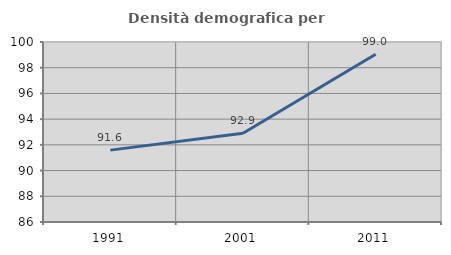
| Category | Densità demografica |
|---|---|
| 1991.0 | 91.591 |
| 2001.0 | 92.902 |
| 2011.0 | 99.049 |